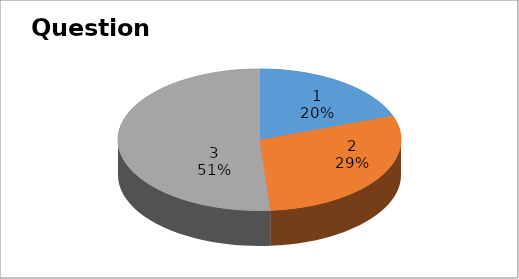
| Category | Series 0 |
|---|---|
| 0 | 8 |
| 1 | 12 |
| 2 | 21 |